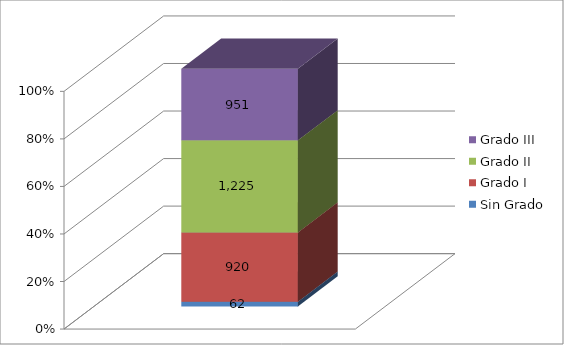
| Category | Sin Grado | Grado I | Grado II | Grado III |
|---|---|---|---|---|
| Dependencia | 62 | 920 | 1225 | 951 |